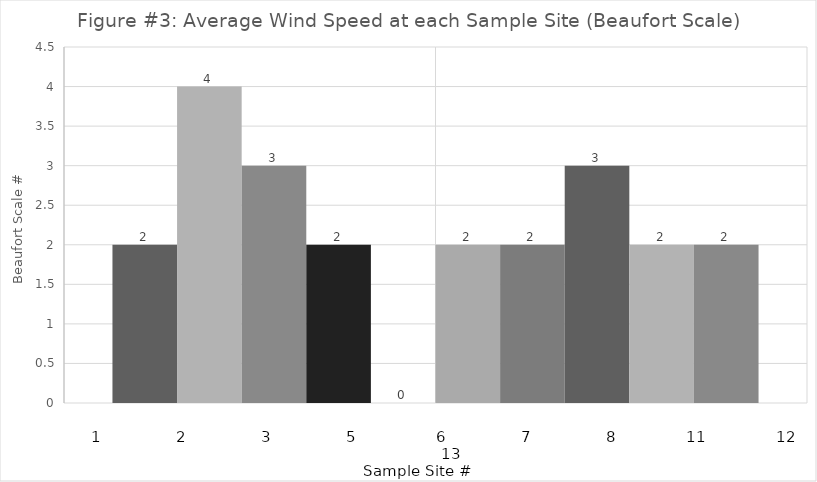
| Category | Series 0 | Series 1 | Series 2 | Series 3 | Series 4 | Series 5 | Series 6 | Series 7 | Series 8 | Series 9 |
|---|---|---|---|---|---|---|---|---|---|---|
| 0 | 2 | 4 | 3 | 2 | 0 | 2 | 2 | 3 | 2 | 2 |